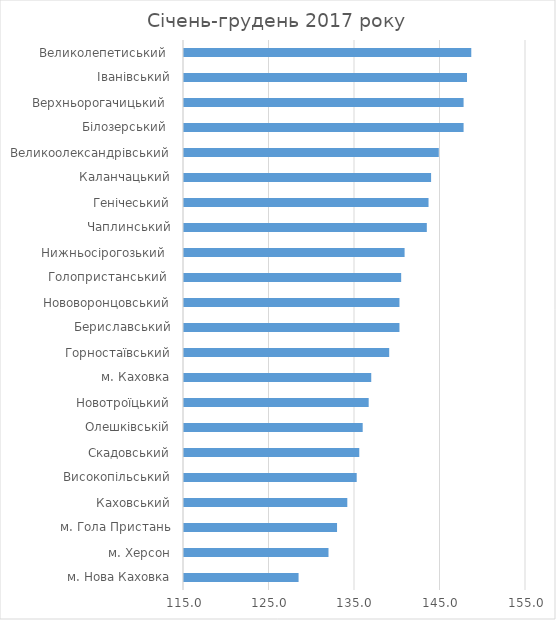
| Category | Series 0 |
|---|---|
| м. Нова Каховка | 128.4 |
| м. Херсон | 131.9 |
| м. Гола Пристань | 132.9 |
| Каховський | 134.1 |
| Високопільський | 135.2 |
| Скадовський | 135.5 |
| Олешківській | 135.9 |
| Новотроїцький | 136.6 |
| м. Каховка | 136.9 |
| Горностаївський | 139 |
| Бериславський | 140.2 |
| Нововоронцовський | 140.2 |
| Голопристанський  | 140.4 |
| Нижньосірогозький  | 140.8 |
| Чаплинський | 143.4 |
| Генічеський | 143.6 |
| Каланчацький | 143.9 |
| Великоолександрівський | 144.8 |
| Білозерський  | 147.7 |
| Верхньорогачицький  | 147.7 |
| Іванівський | 148.1 |
| Великолепетиський  | 148.6 |